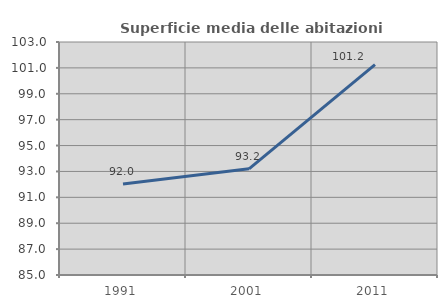
| Category | Superficie media delle abitazioni occupate |
|---|---|
| 1991.0 | 92.023 |
| 2001.0 | 93.2 |
| 2011.0 | 101.246 |